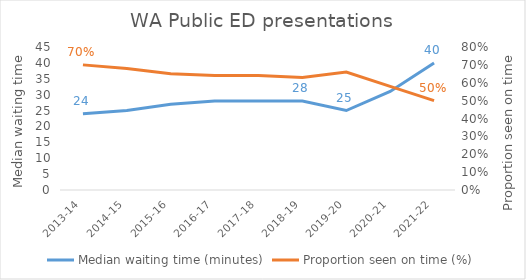
| Category | Median waiting time (minutes) |
|---|---|
| 2013-14 | 24 |
| 2014-15 | 25 |
| 2015-16 | 27 |
| 2016-17 | 28 |
| 2017-18 | 28 |
| 2018-19 | 28 |
| 2019-20 | 25 |
| 2020-21 | 31 |
| 2021-22 | 40 |